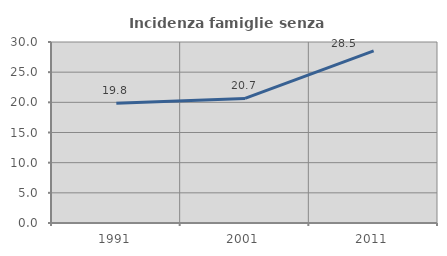
| Category | Incidenza famiglie senza nuclei |
|---|---|
| 1991.0 | 19.845 |
| 2001.0 | 20.655 |
| 2011.0 | 28.533 |